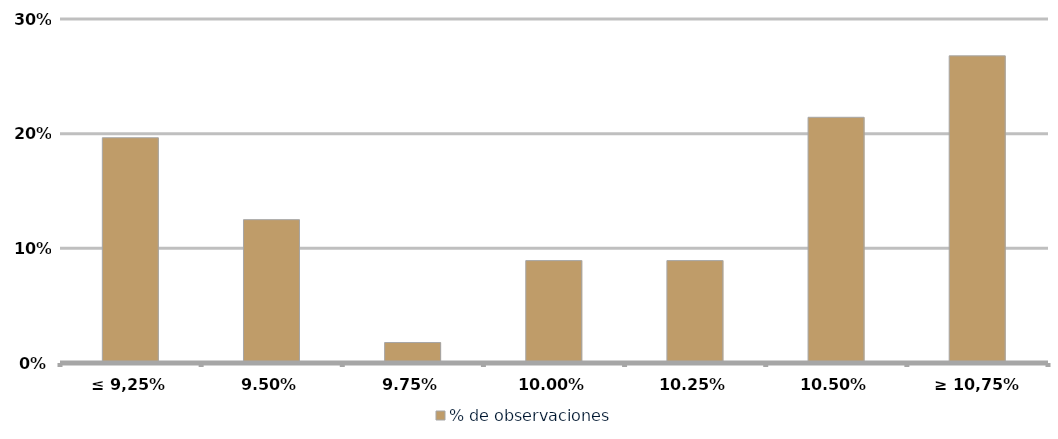
| Category | % de observaciones  |
|---|---|
| ≤ 9,25% | 0.196 |
| 9,50% | 0.125 |
| 9,75% | 0.018 |
| 10,00% | 0.089 |
| 10,25% | 0.089 |
| 10,50% | 0.214 |
| ≥ 10,75% | 0.268 |